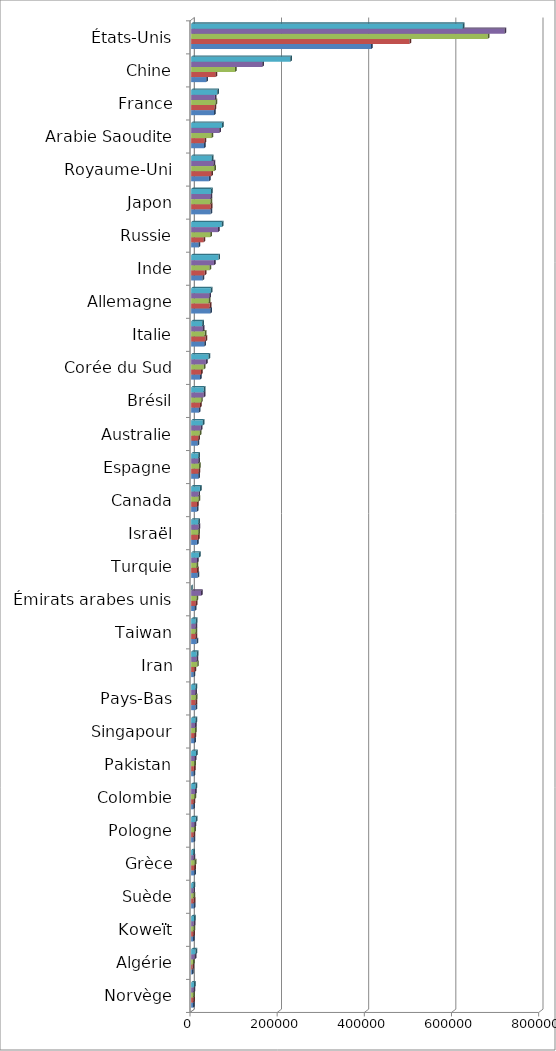
| Category | Series 0 | Series 1 | Series 2 | Series 3 | Series 4 |
|---|---|---|---|---|---|
| Norvège | 4488 | 4846.8 | 5134.2 | 5687.2 | 6510 |
| Algérie | 2163.5 | 2862.6 | 4132.4 | 8048.6 | 10071.6 |
| Koweït | 4219 | 5113.4 | 5466.8 | 5830.8 | 6765.8 |
| Suède | 6078 | 5888.8 | 5282.6 | 5158.6 | 5599.4 |
| Grèce | 7120 | 7168.6 | 8178.6 | 5370.2 | 5047.2 |
| Pologne | 5350.5 | 5485.6 | 6942.6 | 7881.4 | 10417.6 |
| Colombie | 4643 | 5599.8 | 7554.8 | 8998.6 | 9966.8 |
| Pakistan | 5491 | 6336.6 | 7365.8 | 8417.8 | 11176.8 |
| Singapour | 7347 | 7608 | 8804.2 | 8707 | 10147 |
| Pays-Bas | 10023.5 | 10129 | 10790.6 | 9641.8 | 9930.8 |
| Iran | 5293 | 7638.6 | 13768.2 | 12349 | 12692.8 |
| Taiwan | 12147.5 | 10272 | 9905.6 | 10222.2 | 10503.6 |
| Émirats arabes unis | 8149.5 | 10765.8 | 12252.6 | 22687.6 | 0 |
| Turquie | 14499.5 | 13672.6 | 12597 | 13512 | 17972.8 |
| Israël | 13306 | 15671.2 | 16426 | 16959.4 | 16226.6 |
| Canada | 12914 | 13487.8 | 16841.4 | 16630 | 20189.2 |
| Espagne | 16502.5 | 17174.2 | 18257 | 16222.6 | 16292.4 |
| Australie | 14651 | 16092 | 19858.8 | 22020 | 26862.6 |
| Brésil | 17640.5 | 20272.2 | 22945 | 29054.4 | 28854 |
| Corée du Sud | 20310.5 | 22625.2 | 28861.4 | 33989.2 | 39876.8 |
| Italie | 29994.5 | 32835 | 30994.2 | 26888.4 | 25748.4 |
| Allemagne | 43977 | 42715.6 | 40617.4 | 41419.6 | 45028 |
| Inde | 26248.5 | 31132.2 | 42009.4 | 52400 | 62537.4 |
| Russie | 17138.5 | 28448.2 | 43717.8 | 61606 | 70341.4 |
| Japon | 44191.5 | 45049.4 | 44288.6 | 44668.4 | 45669 |
| Royaume-Uni | 40836.5 | 46373.2 | 53095.8 | 51430.4 | 47410 |
| Arabie Saoudite | 29597 | 30639.6 | 47001.8 | 64339 | 71034.4 |
| France | 52524 | 53598.2 | 55845.4 | 54493.2 | 59845.2 |
| Chine | 34591 | 56113.6 | 100586 | 163218 | 227393.8 |
| États-Unis | 412945.5 | 500960.4 | 680567.2 | 719138.4 | 623507.6 |